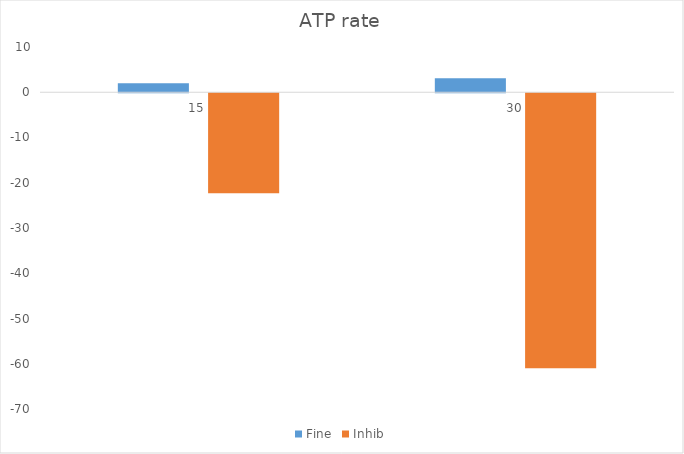
| Category | Fine | Inhib |
|---|---|---|
| 15.0 | 1.992 | -22.1 |
| 30.0 | 3.09 | -60.768 |